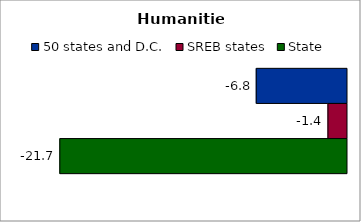
| Category | 50 states and D.C. | SREB states | State |
|---|---|---|---|
| 0 | -6.817 | -1.401 | -21.652 |